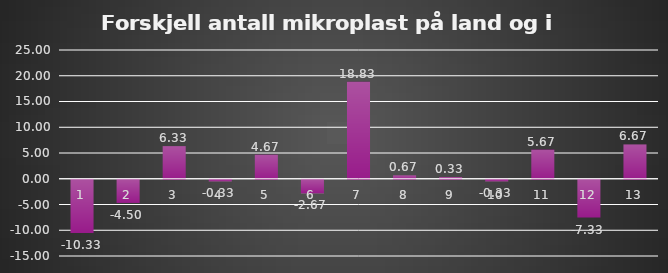
| Category | Diff |
|---|---|
| 1.0 | -10.333 |
| 2.0 | -4.5 |
| 3.0 | 6.333 |
| 4.0 | -0.333 |
| 5.0 | 4.667 |
| 6.0 | -2.667 |
| 7.0 | 18.833 |
| 8.0 | 0.667 |
| 9.0 | 0.333 |
| 10.0 | -0.333 |
| 11.0 | 5.667 |
| 12.0 | -7.333 |
| 13.0 | 6.667 |